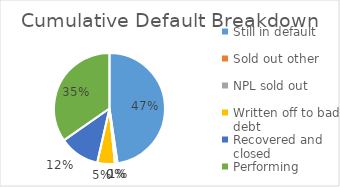
| Category | Cumulative Default Breakdown |
|---|---|
| Still in default | 0.477 |
| Sold out other | 0.008 |
| NPL sold out | 0 |
| Written off to bad debt | 0.051 |
| Recovered and closed | 0.118 |
| Performing | 0.347 |